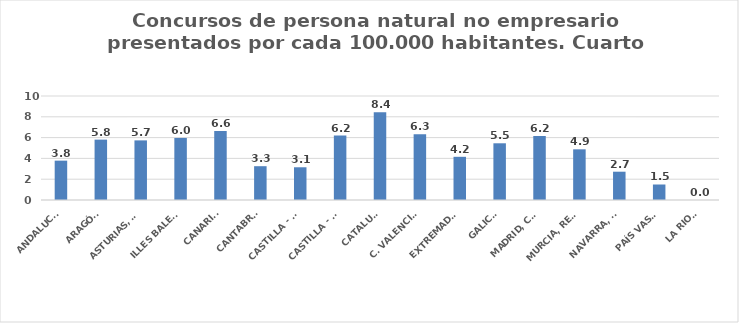
| Category | Series 0 |
|---|---|
| ANDALUCÍA | 3.784 |
| ARAGÓN | 5.806 |
| ASTURIAS, PRINCIPADO | 5.732 |
| ILLES BALEARS | 5.968 |
| CANARIAS | 6.627 |
| CANTABRIA | 3.251 |
| CASTILLA - LEÓN | 3.147 |
| CASTILLA - LA MANCHA | 6.196 |
| CATALUÑA | 8.437 |
| C. VALENCIANA | 6.326 |
| EXTREMADURA | 4.153 |
| GALICIA | 5.453 |
| MADRID, COMUNIDAD | 6.162 |
| MURCIA, REGIÓN | 4.873 |
| NAVARRA, COM. FORAL | 2.721 |
| PAÍS VASCO | 1.491 |
| LA RIOJA | 0 |